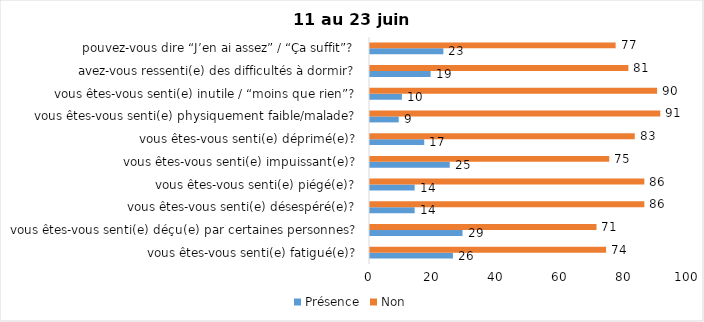
| Category | Présence | Non |
|---|---|---|
| vous êtes-vous senti(e) fatigué(e)? | 26 | 74 |
| vous êtes-vous senti(e) déçu(e) par certaines personnes? | 29 | 71 |
| vous êtes-vous senti(e) désespéré(e)? | 14 | 86 |
| vous êtes-vous senti(e) piégé(e)? | 14 | 86 |
| vous êtes-vous senti(e) impuissant(e)? | 25 | 75 |
| vous êtes-vous senti(e) déprimé(e)? | 17 | 83 |
| vous êtes-vous senti(e) physiquement faible/malade? | 9 | 91 |
| vous êtes-vous senti(e) inutile / “moins que rien”? | 10 | 90 |
| avez-vous ressenti(e) des difficultés à dormir? | 19 | 81 |
| pouvez-vous dire “J’en ai assez” / “Ça suffit”? | 23 | 77 |